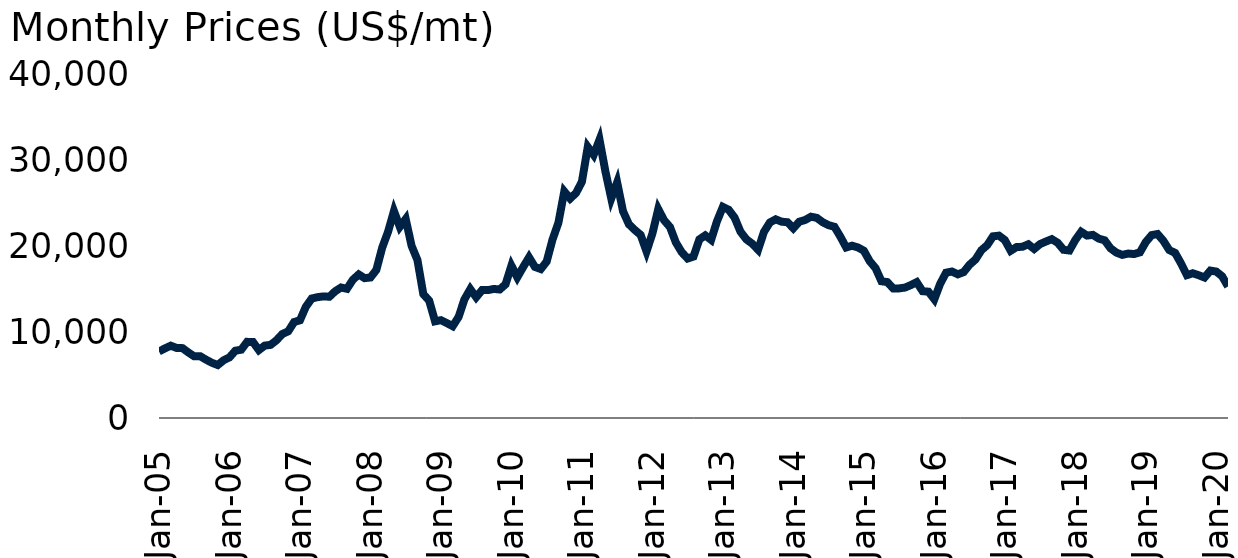
| Category | Tin |
|---|---|
| 2005-01-01 | 7735.75 |
| 2005-02-01 | 8088.75 |
| 2005-03-01 | 8407.39 |
| 2005-04-01 | 8143.81 |
| 2005-05-01 | 8125 |
| 2005-06-01 | 7618.864 |
| 2005-07-01 | 7169.286 |
| 2005-08-01 | 7188.864 |
| 2005-09-01 | 6783.864 |
| 2005-10-01 | 6422.857 |
| 2005-11-01 | 6160 |
| 2005-12-01 | 6713.5 |
| 2006-01-01 | 7051.429 |
| 2006-02-01 | 7826.25 |
| 2006-03-01 | 7939.565 |
| 2006-04-01 | 8853.056 |
| 2006-05-01 | 8837.381 |
| 2006-06-01 | 7896.364 |
| 2006-07-01 | 8418.571 |
| 2006-08-01 | 8502.045 |
| 2006-09-01 | 9039.286 |
| 2006-10-01 | 9768.182 |
| 2006-11-01 | 10079.091 |
| 2006-12-01 | 11158.684 |
| 2007-01-01 | 11361.818 |
| 2007-02-01 | 12933.25 |
| 2007-03-01 | 13892.955 |
| 2007-04-01 | 14052.895 |
| 2007-05-01 | 14140 |
| 2007-06-01 | 14099.76 |
| 2007-07-01 | 14737.84 |
| 2007-08-01 | 15174.318 |
| 2007-09-01 | 15023 |
| 2007-10-01 | 16071.304 |
| 2007-11-01 | 16691.818 |
| 2007-12-01 | 16263.056 |
| 2008-01-01 | 16337.273 |
| 2008-02-01 | 17210 |
| 2008-03-01 | 19803.947 |
| 2008-04-01 | 21658.636 |
| 2008-05-01 | 24062.25 |
| 2008-06-01 | 22229.286 |
| 2008-07-01 | 23139.348 |
| 2008-08-01 | 20026.25 |
| 2008-09-01 | 18368.864 |
| 2008-10-01 | 14401.739 |
| 2008-11-01 | 13643.5 |
| 2008-12-01 | 11240 |
| 2009-01-01 | 11372.857 |
| 2009-02-01 | 11039.25 |
| 2009-03-01 | 10675.909 |
| 2009-04-01 | 11743.5 |
| 2009-05-01 | 13793.421 |
| 2009-06-01 | 14985.682 |
| 2009-07-01 | 14038.913 |
| 2009-08-01 | 14869.75 |
| 2009-09-01 | 14869.091 |
| 2009-10-01 | 15008.864 |
| 2009-11-01 | 14942.381 |
| 2009-12-01 | 15546.905 |
| 2010-01-01 | 17714.75 |
| 2010-02-01 | 16361.75 |
| 2010-03-01 | 17549.348 |
| 2010-04-01 | 18683.5 |
| 2010-05-01 | 17566.053 |
| 2010-06-01 | 17319.773 |
| 2010-07-01 | 18191.364 |
| 2010-08-01 | 20754.762 |
| 2010-09-01 | 22701.136 |
| 2010-10-01 | 26342.619 |
| 2010-11-01 | 25519.091 |
| 2010-12-01 | 26163.333 |
| 2011-01-01 | 27465.25 |
| 2011-02-01 | 31526 |
| 2011-03-01 | 30590.93 |
| 2011-04-01 | 32363.31 |
| 2011-05-01 | 28676.45 |
| 2011-06-01 | 25519.68 |
| 2011-07-01 | 27398.1 |
| 2011-08-01 | 24042.43 |
| 2011-09-01 | 22526.6 |
| 2011-10-01 | 21868.64 |
| 2011-11-01 | 21291.7 |
| 2011-12-01 | 19375.01 |
| 2012-01-01 | 21438.63 |
| 2012-02-01 | 24293.31 |
| 2012-03-01 | 22985.43 |
| 2012-04-01 | 22200.62 |
| 2012-05-01 | 20405.238 |
| 2012-06-01 | 19271.071 |
| 2012-07-01 | 18546.091 |
| 2012-08-01 | 18772.62 |
| 2012-09-01 | 20771.26 |
| 2012-10-01 | 21233.7 |
| 2012-11-01 | 20713.068 |
| 2012-12-01 | 22880.895 |
| 2013-01-01 | 24545.9 |
| 2013-02-01 | 24211.738 |
| 2013-03-01 | 23296.524 |
| 2013-04-01 | 21662.25 |
| 2013-05-01 | 20775.826 |
| 2013-06-01 | 20267.4 |
| 2013-07-01 | 19563.826 |
| 2013-08-01 | 21644.432 |
| 2013-09-01 | 22735.071 |
| 2013-10-01 | 23101.587 |
| 2013-11-01 | 22826.881 |
| 2013-12-01 | 22762.125 |
| 2014-01-01 | 22063.86 |
| 2014-02-01 | 22820.67 |
| 2014-03-01 | 23024.31 |
| 2014-04-01 | 23405.2 |
| 2014-05-01 | 23271.25 |
| 2014-06-01 | 22762 |
| 2014-07-01 | 22424.01 |
| 2014-08-01 | 22231.05 |
| 2014-09-01 | 21090.52 |
| 2014-10-01 | 19830.41 |
| 2014-11-01 | 20033.47 |
| 2014-12-01 | 19829.71 |
| 2015-01-01 | 19454.12 |
| 2015-02-01 | 18233.91 |
| 2015-03-01 | 17421.91 |
| 2015-04-01 | 15900.88 |
| 2015-05-01 | 15803.59 |
| 2015-06-01 | 15064.94 |
| 2015-07-01 | 15071.53 |
| 2015-08-01 | 15163.77 |
| 2015-09-01 | 15453.34 |
| 2015-10-01 | 15794.61 |
| 2015-11-01 | 14745.29 |
| 2015-12-01 | 14691.69 |
| 2016-01-01 | 13808.08 |
| 2016-02-01 | 15610.14 |
| 2016-03-01 | 16897.6 |
| 2016-04-01 | 17032.71 |
| 2016-05-01 | 16706.95 |
| 2016-06-01 | 16966.69 |
| 2016-07-01 | 17826.23 |
| 2016-08-01 | 18427.02 |
| 2016-09-01 | 19499.52 |
| 2016-10-01 | 20099.76 |
| 2016-11-01 | 21126.09 |
| 2016-12-01 | 21204.35 |
| 2017-01-01 | 20691.79 |
| 2017-02-01 | 19446.47 |
| 2017-03-01 | 19875.2 |
| 2017-04-01 | 19910.32 |
| 2017-05-01 | 20200.33 |
| 2017-06-01 | 19658.84 |
| 2017-07-01 | 20223.48 |
| 2017-08-01 | 20521 |
| 2017-09-01 | 20796.62 |
| 2017-10-01 | 20376.09 |
| 2017-11-01 | 19557.52 |
| 2017-12-01 | 19476.37 |
| 2018-01-01 | 20696.91 |
| 2018-02-01 | 21651.55 |
| 2018-03-01 | 21211.94 |
| 2018-04-01 | 21291.1 |
| 2018-05-01 | 20858.83 |
| 2018-06-01 | 20660.52 |
| 2018-07-01 | 19729.8 |
| 2018-08-01 | 19228.77 |
| 2018-09-01 | 18967.13 |
| 2018-10-01 | 19121.48 |
| 2018-11-01 | 19064.86 |
| 2018-12-01 | 19259.58 |
| 2019-01-01 | 20457.75 |
| 2019-02-01 | 21263.95 |
| 2019-03-01 | 21393.4 |
| 2019-04-01 | 20604.3 |
| 2019-05-01 | 19523.9 |
| 2019-06-01 | 19193.2 |
| 2019-07-01 | 17977.85 |
| 2019-08-01 | 16608.99 |
| 2019-09-01 | 16830.62 |
| 2019-10-01 | 16603.39 |
| 2019-11-01 | 16335.48 |
| 2019-12-01 | 17141.05 |
| 2020-01-01 | 17029.18 |
| 2020-02-01 | 16480.3 |
| 2020-03-01 | 15290.91 |